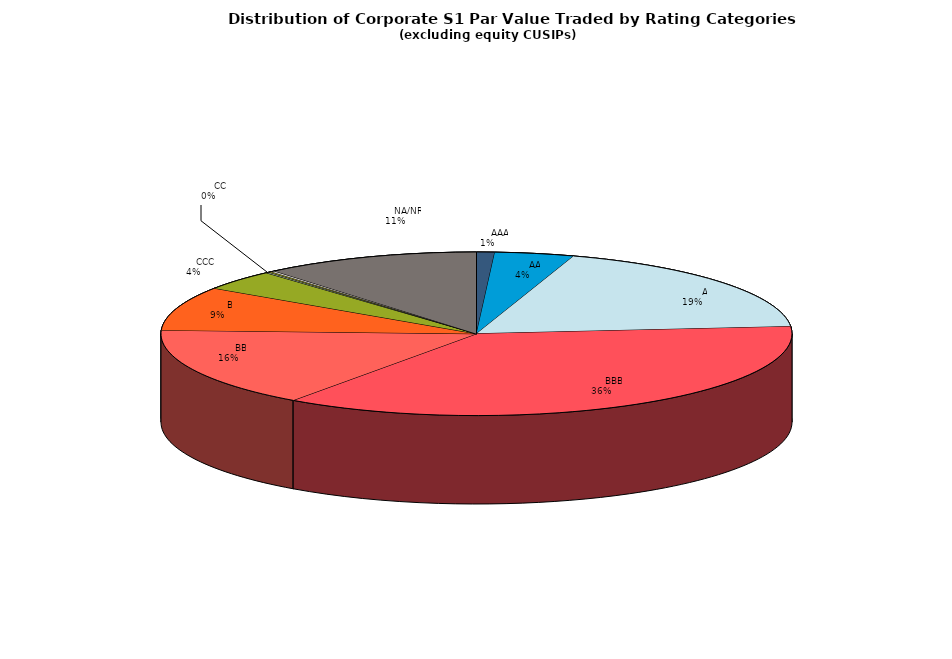
| Category | Series 0 |
|---|---|
|         AAA | 380144841.023 |
|         AA | 1665670592.376 |
|         A | 7630505186.772 |
|         BBB | 14874818267.444 |
|         BB | 6495126674.06 |
|         B | 3565384004.136 |
|         CCC | 1638626448.591 |
|         CC | 72446170.128 |
|         C | 69075433.047 |
|         D | 78799964.379 |
|         NA/NR | 4538804831.047 |